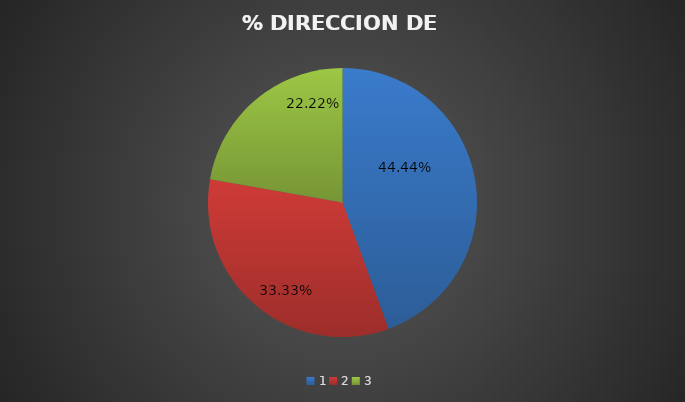
| Category | Series 0 |
|---|---|
| 0 | 0.444 |
| 1 | 0.333 |
| 2 | 0.222 |